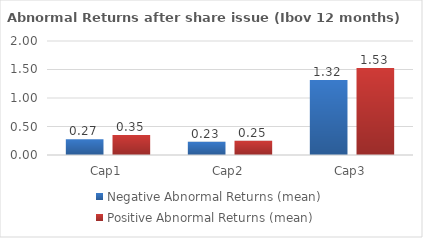
| Category | Negative Abnormal Returns (mean) | Positive Abnormal Returns (mean) |
|---|---|---|
| Cap1 | 0.275 | 0.349 |
| Cap2 | 0.234 | 0.251 |
| Cap3 | 1.315 | 1.525 |